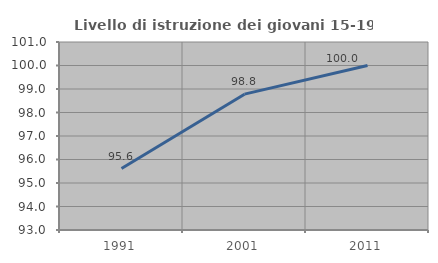
| Category | Livello di istruzione dei giovani 15-19 anni |
|---|---|
| 1991.0 | 95.614 |
| 2001.0 | 98.78 |
| 2011.0 | 100 |